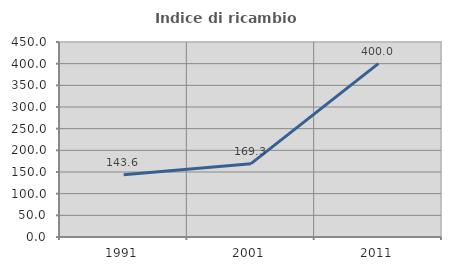
| Category | Indice di ricambio occupazionale  |
|---|---|
| 1991.0 | 143.564 |
| 2001.0 | 169.307 |
| 2011.0 | 400 |